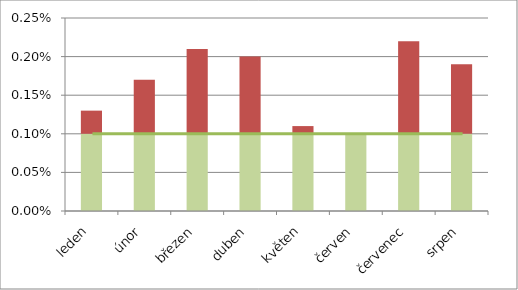
| Category | pod | nad |
|---|---|---|
| leden | 0.001 | 0 |
| únor | 0.001 | 0.001 |
| březen | 0.001 | 0.001 |
| duben | 0.001 | 0.001 |
| květen | 0.001 | 0 |
| červen | 0.001 | 0 |
| červenec | 0.001 | 0.001 |
| srpen | 0.001 | 0.001 |